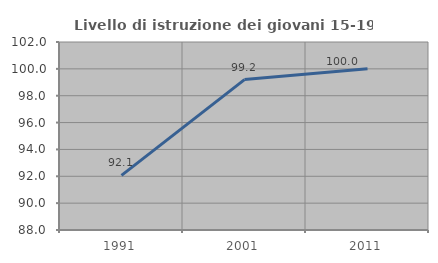
| Category | Livello di istruzione dei giovani 15-19 anni |
|---|---|
| 1991.0 | 92.063 |
| 2001.0 | 99.2 |
| 2011.0 | 100 |